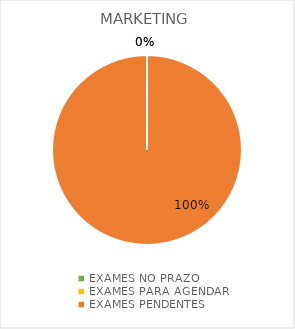
| Category | MARKETING |
|---|---|
| EXAMES NO PRAZO | 0 |
| EXAMES PARA AGENDAR | 0 |
| EXAMES PENDENTES | 4 |